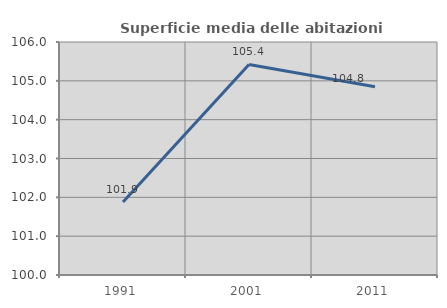
| Category | Superficie media delle abitazioni occupate |
|---|---|
| 1991.0 | 101.881 |
| 2001.0 | 105.422 |
| 2011.0 | 104.848 |